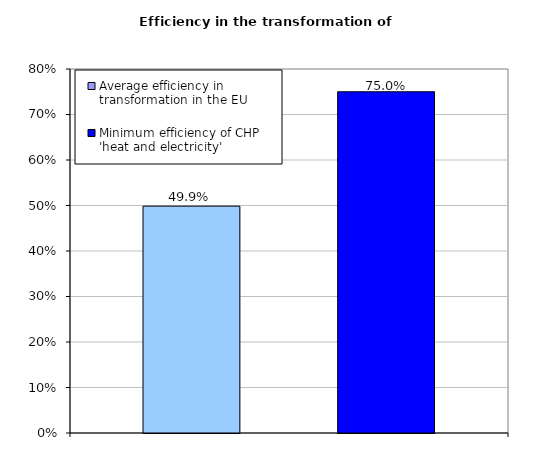
| Category | Average efficiency in transformation in the EU | Minimum efficiency of CHP 'heat and electricity' |
|---|---|---|
|  | 0.499 | 0.75 |